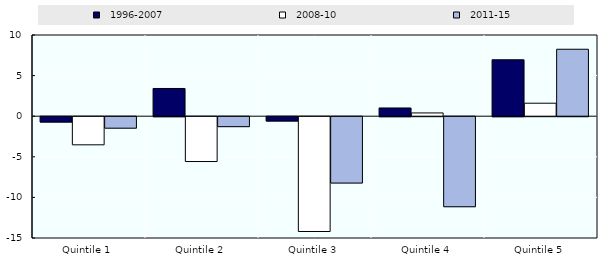
| Category |   1996-2007 |   2008-10 |   2011-15 |
|---|---|---|---|
| Quintile 1 | -0.657 | -3.464 | -1.413 |
| Quintile 2 | 3.414 | -5.523 | -1.225 |
| Quintile 3 | -0.528 | -14.139 | -8.173 |
| Quintile 4 | 1.014 | 0.402 | -11.089 |
| Quintile 5 | 6.95 | 1.6 | 8.246 |